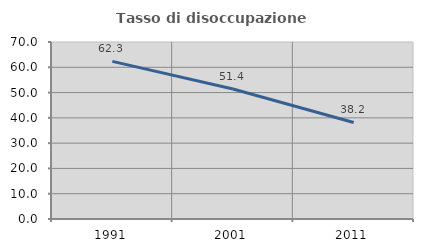
| Category | Tasso di disoccupazione giovanile  |
|---|---|
| 1991.0 | 62.324 |
| 2001.0 | 51.402 |
| 2011.0 | 38.182 |